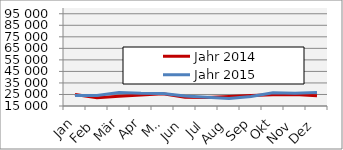
| Category | Jahr 2014 | Jahr 2015 |
|---|---|---|
| 0 | 24904.234 | 24035.584 |
| 1 | 22181.267 | 24073.547 |
| 2 | 23502.939 | 26787.309 |
| 3 | 24644.186 | 26000.634 |
| 4 | 25555.948 | 25748.53 |
| 5 | 22605.013 | 23769.616 |
| 6 | 22341.602 | 22562.624 |
| 7 | 23221.382 | 21524.041 |
| 8 | 24172.032 | 23299.038 |
| 9 | 24708.102 | 26517.2 |
| 10 | 24895.857 | 26127.402 |
| 11 | 23967.278 | 26782.914 |